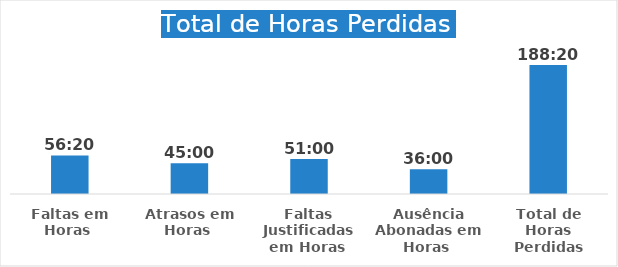
| Category | Series 0 |
|---|---|
| Faltas em Horas  | 1900-01-02 08:20:00 |
| Atrasos em Horas  | 1900-01-01 21:00:00 |
| Faltas Justificadas em Horas  | 1900-01-02 03:00:00 |
| Ausência Abonadas em Horas  | 1900-01-01 12:00:00 |
| Total de Horas Perdidas | 1900-01-07 20:20:00 |